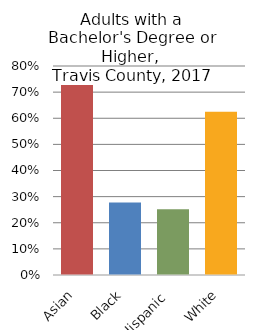
| Category |     Bachelor's degree or higher |
|---|---|
| Asian | 0.727 |
| Black | 0.277 |
| Hispanic  | 0.252 |
| White | 0.625 |